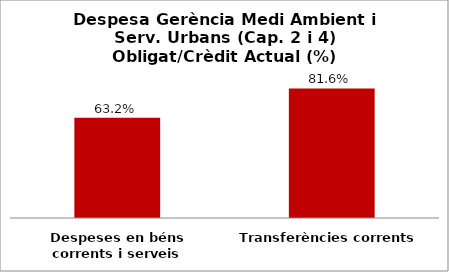
| Category | Series 0 |
|---|---|
| Despeses en béns corrents i serveis | 0.632 |
| Transferències corrents | 0.816 |